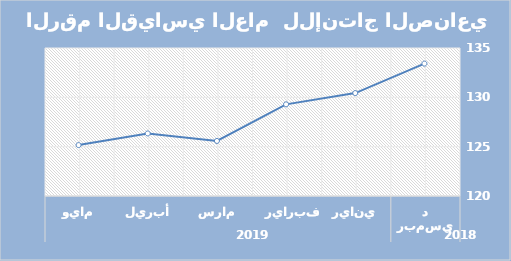
| Category | Series 0 |
|---|---|
| 0 | 133.42 |
| 1 | 130.43 |
| 2 | 129.29 |
| 3 | 125.58 |
| 4 | 126.34 |
| 5 | 125.16 |